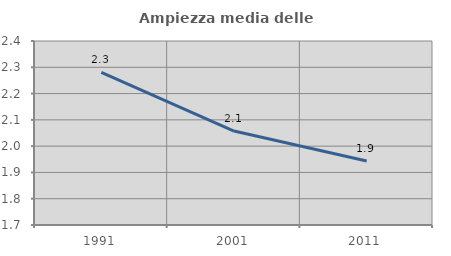
| Category | Ampiezza media delle famiglie |
|---|---|
| 1991.0 | 2.28 |
| 2001.0 | 2.057 |
| 2011.0 | 1.944 |